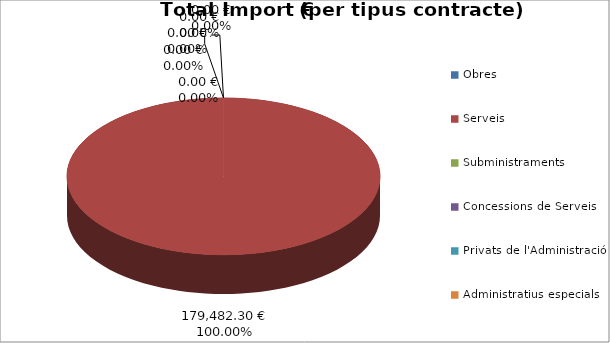
| Category | Total preu              (amb iva) |
|---|---|
| Obres | 0 |
| Serveis | 179482.3 |
| Subministraments | 0 |
| Concessions de Serveis | 0 |
| Privats de l'Administració | 0 |
| Administratius especials | 0 |